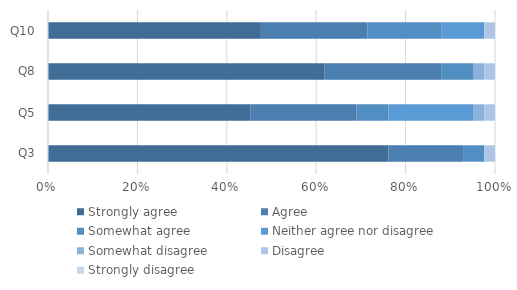
| Category | Strongly agree | Agree | Somewhat agree | Neither agree nor disagree | Somewhat disagree | Disagree | Strongly disagree |
|---|---|---|---|---|---|---|---|
| Q3 | 0.762 | 0.167 | 0.048 | 0 | 0 | 0.024 | 0 |
| Q5 | 0.452 | 0.238 | 0.071 | 0.19 | 0.024 | 0.024 | 0 |
| Q8 | 0.619 | 0.262 | 0.071 | 0 | 0.024 | 0.024 | 0 |
| Q10 | 0.476 | 0.238 | 0.167 | 0.095 | 0 | 0.024 | 0 |